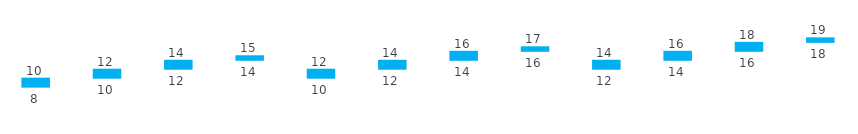
| Category | Series 0 | Series 1 | Series 2 |
|---|---|---|---|
| <2 | 8 | 2 | 10 |
| 2>&<4 | 10 | 2 | 12 |
| 4>&<10 | 12 | 2 | 14 |
| >10 | 14 | 1 | 15 |
| <2 | 10 | 2 | 12 |
| 2>&<4 | 12 | 2 | 14 |
| 4>&<10 | 14 | 2 | 16 |
| >10 | 16 | 1 | 17 |
| <2 | 12 | 2 | 14 |
| 2>&<4 | 14 | 2 | 16 |
| 4>&<10 | 16 | 2 | 18 |
| >10 | 18 | 1 | 19 |